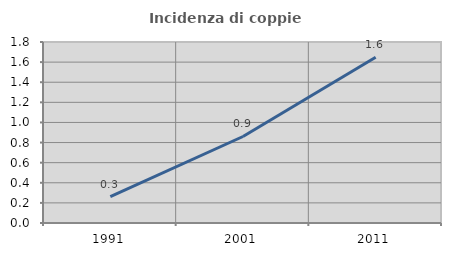
| Category | Incidenza di coppie miste |
|---|---|
| 1991.0 | 0.263 |
| 2001.0 | 0.86 |
| 2011.0 | 1.648 |